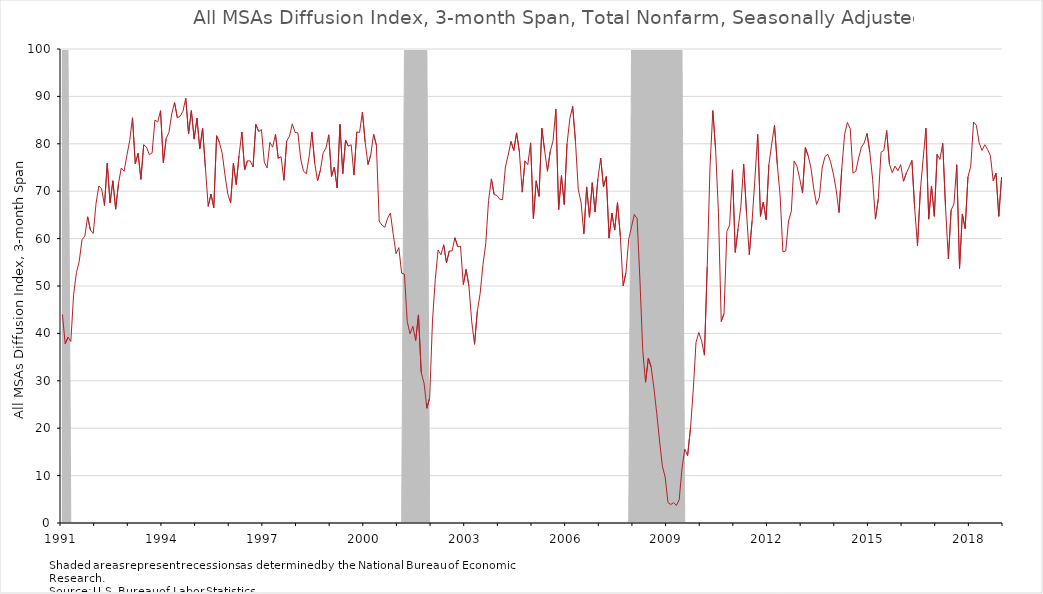
| Category | DI_3month |
|---|---|
| 1991 | 44 |
| 1991 | 37.8 |
| 1991 | 39.2 |
| 1991 | 38.3 |
| 1991 | 48.2 |
| 1991 | 52.8 |
| 1991 | 55.2 |
| 1991 | 59.8 |
| 1991 | 60.5 |
| 1991 | 64.6 |
| 1991 | 61.8 |
| 1991 | 61.1 |
| 1992 | 67.4 |
| 1992 | 71.1 |
| 1992 | 70.5 |
| 1992 | 67 |
| 1992 | 75.9 |
| 1992 | 67.5 |
| 1992 | 72.2 |
| 1992 | 66.2 |
| 1992 | 71.6 |
| 1992 | 74.9 |
| 1992 | 74.2 |
| 1992 | 77.5 |
| 1993 | 80.7 |
| 1993 | 85.5 |
| 1993 | 75.8 |
| 1993 | 78 |
| 1993 | 72.5 |
| 1993 | 79.8 |
| 1993 | 79.3 |
| 1993 | 77.7 |
| 1993 | 78.1 |
| 1993 | 85 |
| 1993 | 84.6 |
| 1993 | 87 |
| 1994 | 76 |
| 1994 | 81.1 |
| 1994 | 82.4 |
| 1994 | 86.3 |
| 1994 | 88.7 |
| 1994 | 85.5 |
| 1994 | 85.8 |
| 1994 | 86.9 |
| 1994 | 89.6 |
| 1994 | 82.1 |
| 1994 | 87 |
| 1994 | 81 |
| 1995 | 85.4 |
| 1995 | 78.9 |
| 1995 | 83.3 |
| 1995 | 75 |
| 1995 | 66.8 |
| 1995 | 69.4 |
| 1995 | 66.5 |
| 1995 | 81.7 |
| 1995 | 80.3 |
| 1995 | 78 |
| 1995 | 73.4 |
| 1995 | 69.4 |
| 1996 | 67.5 |
| 1996 | 75.9 |
| 1996 | 71.4 |
| 1996 | 77.5 |
| 1996 | 82.5 |
| 1996 | 74.5 |
| 1996 | 76.4 |
| 1996 | 76.4 |
| 1996 | 75.1 |
| 1996 | 84.1 |
| 1996 | 82.6 |
| 1996 | 83 |
| 1997 | 76.2 |
| 1997 | 74.9 |
| 1997 | 80.3 |
| 1997 | 79.3 |
| 1997 | 82 |
| 1997 | 76.9 |
| 1997 | 77.3 |
| 1997 | 72.3 |
| 1997 | 80.6 |
| 1997 | 81.6 |
| 1997 | 84.2 |
| 1997 | 82.4 |
| 1998 | 82.3 |
| 1998 | 76.8 |
| 1998 | 74.2 |
| 1998 | 73.7 |
| 1998 | 77.3 |
| 1998 | 82.5 |
| 1998 | 75.9 |
| 1998 | 72.2 |
| 1998 | 74.4 |
| 1998 | 78.1 |
| 1998 | 79.1 |
| 1998 | 81.9 |
| 1999 | 73.1 |
| 1999 | 75.1 |
| 1999 | 70.7 |
| 1999 | 84.1 |
| 1999 | 73.7 |
| 1999 | 80.8 |
| 1999 | 79.5 |
| 1999 | 79.8 |
| 1999 | 73.4 |
| 1999 | 82.5 |
| 1999 | 82.4 |
| 1999 | 86.7 |
| 2000 | 80.3 |
| 2000 | 75.6 |
| 2000 | 77.7 |
| 2000 | 82 |
| 2000 | 79.7 |
| 2000 | 63.7 |
| 2000 | 62.8 |
| 2000 | 62.4 |
| 2000 | 64.3 |
| 2000 | 65.4 |
| 2000 | 60.9 |
| 2000 | 56.8 |
| 2001 | 58.1 |
| 2001 | 52.7 |
| 2001 | 52.5 |
| 2001 | 42.5 |
| 2001 | 39.9 |
| 2001 | 41.5 |
| 2001 | 38.5 |
| 2001 | 43.9 |
| 2001 | 31.7 |
| 2001 | 29.5 |
| 2001 | 24.2 |
| 2001 | 26.4 |
| 2002 | 42.6 |
| 2002 | 51.4 |
| 2002 | 57.6 |
| 2002 | 56.6 |
| 2002 | 58.7 |
| 2002 | 54.9 |
| 2002 | 57.4 |
| 2002 | 57.4 |
| 2002 | 60.2 |
| 2002 | 58.3 |
| 2002 | 58.4 |
| 2002 | 50.3 |
| 2003 | 53.5 |
| 2003 | 50 |
| 2003 | 42.5 |
| 2003 | 37.7 |
| 2003 | 44.7 |
| 2003 | 48.4 |
| 2003 | 54.5 |
| 2003 | 58.9 |
| 2003 | 68 |
| 2003 | 72.6 |
| 2003 | 69.3 |
| 2003 | 69.1 |
| 2004 | 68.3 |
| 2004 | 68.2 |
| 2004 | 75.1 |
| 2004 | 77.6 |
| 2004 | 80.5 |
| 2004 | 78.6 |
| 2004 | 82.3 |
| 2004 | 78.3 |
| 2004 | 69.8 |
| 2004 | 76.4 |
| 2004 | 75.6 |
| 2004 | 80.2 |
| 2005 | 64.2 |
| 2005 | 72.2 |
| 2005 | 68.9 |
| 2005 | 83.3 |
| 2005 | 78.6 |
| 2005 | 74.2 |
| 2005 | 78.4 |
| 2005 | 80.6 |
| 2005 | 87.3 |
| 2005 | 66.1 |
| 2005 | 73.3 |
| 2005 | 67.2 |
| 2006 | 80 |
| 2006 | 85.3 |
| 2006 | 87.9 |
| 2006 | 80.5 |
| 2006 | 70.4 |
| 2006 | 67.6 |
| 2006 | 61 |
| 2006 | 70.9 |
| 2006 | 64.5 |
| 2006 | 71.8 |
| 2006 | 65.6 |
| 2006 | 72.6 |
| 2007 | 77 |
| 2007 | 70.9 |
| 2007 | 73.1 |
| 2007 | 60.1 |
| 2007 | 65.4 |
| 2007 | 61.8 |
| 2007 | 67.6 |
| 2007 | 60.5 |
| 2007 | 50 |
| 2007 | 52.8 |
| 2007 | 59.9 |
| 2007 | 62.5 |
| 2008 | 65.1 |
| 2008 | 64.2 |
| 2008 | 51.2 |
| 2008 | 36.4 |
| 2008 | 29.7 |
| 2008 | 34.8 |
| 2008 | 32.9 |
| 2008 | 28.4 |
| 2008 | 23.1 |
| 2008 | 17.3 |
| 2008 | 12 |
| 2008 | 9.7 |
| 2009 | 4.3 |
| 2009 | 3.9 |
| 2009 | 4.3 |
| 2009 | 3.7 |
| 2009 | 4.9 |
| 2009 | 11.5 |
| 2009 | 15.6 |
| 2009 | 14.2 |
| 2009 | 19.8 |
| 2009 | 27.9 |
| 2009 | 38.1 |
| 2009 | 40.2 |
| 2010 | 38.4 |
| 2010 | 35.4 |
| 2010 | 54.1 |
| 2010 | 75.2 |
| 2010 | 87 |
| 2010 | 78.7 |
| 2010 | 65.5 |
| 2010 | 42.5 |
| 2010 | 44.2 |
| 2010 | 61.5 |
| 2010 | 62.9 |
| 2010 | 74.5 |
| 2011 | 57.1 |
| 2011 | 62.1 |
| 2011 | 66.8 |
| 2011 | 75.7 |
| 2011 | 65.6 |
| 2011 | 56.6 |
| 2011 | 63.7 |
| 2011 | 72.5 |
| 2011 | 82 |
| 2011 | 64.7 |
| 2011 | 67.7 |
| 2011 | 64 |
| 2012 | 75.6 |
| 2012 | 80 |
| 2012 | 83.9 |
| 2012 | 75.6 |
| 2012 | 69 |
| 2012 | 57.2 |
| 2012 | 57.4 |
| 2012 | 63.7 |
| 2012 | 65.8 |
| 2012 | 76.4 |
| 2012 | 75.3 |
| 2012 | 72.6 |
| 2013 | 69.6 |
| 2013 | 79.2 |
| 2013 | 77.5 |
| 2013 | 74.9 |
| 2013 | 70.5 |
| 2013 | 67.2 |
| 2013 | 68.7 |
| 2013 | 74.9 |
| 2013 | 77.3 |
| 2013 | 77.8 |
| 2013 | 76.2 |
| 2013 | 73.6 |
| 2014 | 70.3 |
| 2014 | 65.5 |
| 2014 | 74.8 |
| 2014 | 82 |
| 2014 | 84.5 |
| 2014 | 83.2 |
| 2014 | 73.8 |
| 2014 | 74.2 |
| 2014 | 77 |
| 2014 | 79.3 |
| 2014 | 80.2 |
| 2014 | 82.2 |
| 2015 | 78.2 |
| 2015 | 72.5 |
| 2015 | 64.1 |
| 2015 | 68.3 |
| 2015 | 78.2 |
| 2015 | 78.6 |
| 2015 | 82.8 |
| 2015 | 75.7 |
| 2015 | 73.9 |
| 2015 | 75.3 |
| 2015 | 74.3 |
| 2015 | 75.6 |
| 2016 | 72.1 |
| 2016 | 73.8 |
| 2016 | 75.1 |
| 2016 | 76.5 |
| 2016 | 66.3 |
| 2016 | 58.5 |
| 2016 | 70 |
| 2016 | 76.7 |
| 2016 | 83.3 |
| 2016 | 64.1 |
| 2016 | 71.1 |
| 2016 | 64.7 |
| 2017 | 77.8 |
| 2017 | 76.7 |
| 2017 | 80.1 |
| 2017 | 66.7 |
| 2017 | 55.7 |
| 2017 | 66 |
| 2017 | 67.3 |
| 2017 | 75.6 |
| 2017 | 53.7 |
| 2017 | 65.2 |
| 2017 | 62.1 |
| 2017 | 73 |
| 2018 | 75.3 |
| 2018 | 84.6 |
| 2018 | 83.9 |
| 2018 | 80.2 |
| 2018 | 78.6 |
| 2018 | 79.8 |
| 2018 | 78.8 |
| 2018 | 77.5 |
| 2018 | 72.2 |